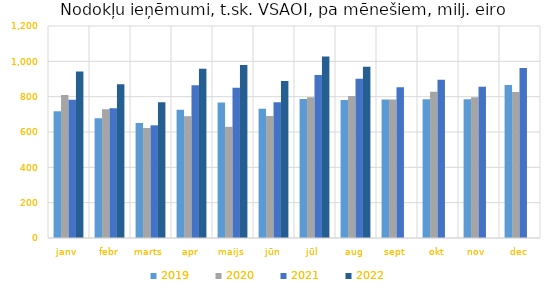
| Category | 2019 | 2020 | 2021 | 2022 |
|---|---|---|---|---|
| janv | 717665.072 | 809688.721 | 782986.001 | 941791.936 |
| febr | 677510.103 | 729172.133 | 734852.065 | 870814.989 |
| marts | 650253.135 | 622803.58 | 637891.51 | 769054.685 |
| apr | 726487.169 | 689512.187 | 864350.424 | 957835.152 |
| maijs | 766741.521 | 629295.897 | 850252.991 | 978678.559 |
| jūn | 731242 | 690672.482 | 768738.388 | 888916.233 |
| jūl | 786636.326 | 796698.852 | 922262.256 | 1027456.888 |
| aug | 780536.674 | 803951.557 | 901674.184 | 969994.081 |
| sept | 784169.124 | 783355.666 | 852725.586 | 0 |
| okt | 785502.085 | 827797.907 | 895873.595 | 0 |
| nov | 784818.309 | 797101.461 | 856461.1 | 0 |
| dec | 865773.712 | 826496.37 | 962936.043 | 0 |